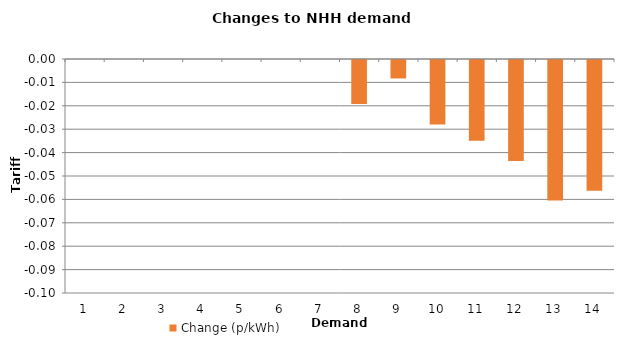
| Category | Change (p/kWh) |
|---|---|
| 1.0 | 0 |
| 2.0 | 0 |
| 3.0 | 0 |
| 4.0 | 0 |
| 5.0 | 0 |
| 6.0 | 0 |
| 7.0 | 0 |
| 8.0 | -0.019 |
| 9.0 | -0.008 |
| 10.0 | -0.028 |
| 11.0 | -0.034 |
| 12.0 | -0.043 |
| 13.0 | -0.06 |
| 14.0 | -0.056 |